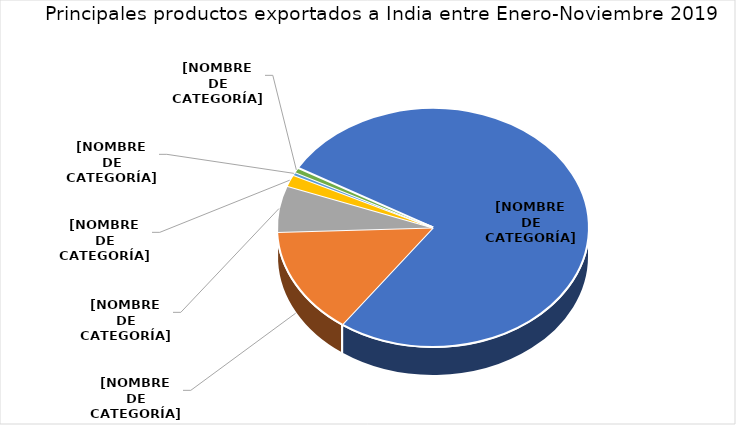
| Category | Series 0 |
|---|---|
| Las demás maderas escuadradas tropicales  | 0.766 |
| Las demás maderas en bruto | 0.145 |
| Desperdicios y desechos, de fundición, de hierro o acero. | 0.063 |
| Desperdicios y desechos, de aluminio. | 0.016 |
| Las demás maderas aserradas o desbastadas longitudinalmente | 0.004 |
| 2 productos restantes | 0.006 |